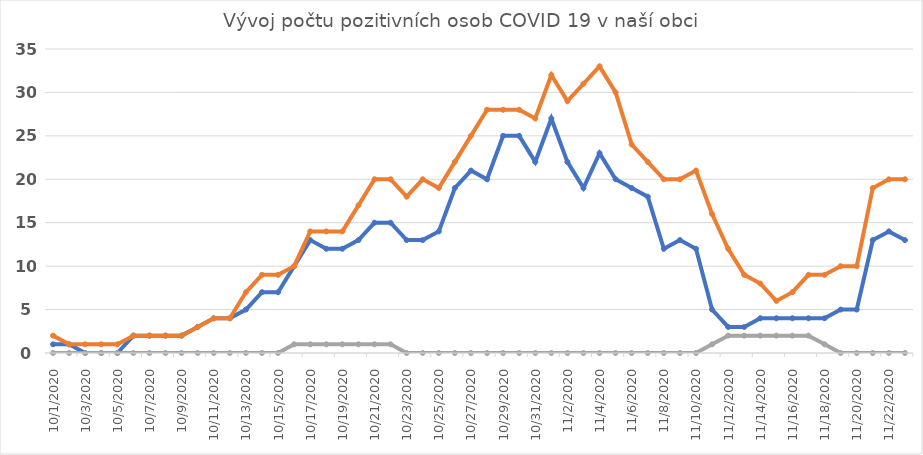
| Category | Series 0 | Series 1 | Series 2 |
|---|---|---|---|
| 10/1/20 | 1 | 2 | 0 |
| 10/2/20 | 1 | 1 | 0 |
| 10/3/20 | 0 | 1 | 0 |
| 10/4/20 | 0 | 1 | 0 |
| 10/5/20 | 0 | 1 | 0 |
| 10/6/20 | 2 | 2 | 0 |
| 10/7/20 | 2 | 2 | 0 |
| 10/8/20 | 2 | 2 | 0 |
| 10/9/20 | 2 | 2 | 0 |
| 10/10/20 | 3 | 3 | 0 |
| 10/11/20 | 4 | 4 | 0 |
| 10/12/20 | 4 | 4 | 0 |
| 10/13/20 | 5 | 7 | 0 |
| 10/14/20 | 7 | 9 | 0 |
| 10/15/20 | 7 | 9 | 0 |
| 10/16/20 | 10 | 10 | 1 |
| 10/17/20 | 13 | 14 | 1 |
| 10/18/20 | 12 | 14 | 1 |
| 10/19/20 | 12 | 14 | 1 |
| 10/20/20 | 13 | 17 | 1 |
| 10/21/20 | 15 | 20 | 1 |
| 10/22/20 | 15 | 20 | 1 |
| 10/23/20 | 13 | 18 | 0 |
| 10/24/20 | 13 | 20 | 0 |
| 10/25/20 | 14 | 19 | 0 |
| 10/26/20 | 19 | 22 | 0 |
| 10/27/20 | 21 | 25 | 0 |
| 10/28/20 | 20 | 28 | 0 |
| 10/29/20 | 25 | 28 | 0 |
| 10/30/20 | 25 | 28 | 0 |
| 10/31/20 | 22 | 27 | 0 |
| 11/1/20 | 27 | 32 | 0 |
| 11/2/20 | 22 | 29 | 0 |
| 11/3/20 | 19 | 31 | 0 |
| 11/4/20 | 23 | 33 | 0 |
| 11/5/20 | 20 | 30 | 0 |
| 11/6/20 | 19 | 24 | 0 |
| 11/7/20 | 18 | 22 | 0 |
| 11/8/20 | 12 | 20 | 0 |
| 11/9/20 | 13 | 20 | 0 |
| 11/10/20 | 12 | 21 | 0 |
| 11/11/20 | 5 | 16 | 1 |
| 11/12/20 | 3 | 12 | 2 |
| 11/13/20 | 3 | 9 | 2 |
| 11/14/20 | 4 | 8 | 2 |
| 11/15/20 | 4 | 6 | 2 |
| 11/16/20 | 4 | 7 | 2 |
| 11/17/20 | 4 | 9 | 2 |
| 11/18/20 | 4 | 9 | 1 |
| 11/19/20 | 5 | 10 | 0 |
| 11/20/20 | 5 | 10 | 0 |
| 11/21/20 | 13 | 19 | 0 |
| 11/22/20 | 14 | 20 | 0 |
| 11/23/20 | 13 | 20 | 0 |